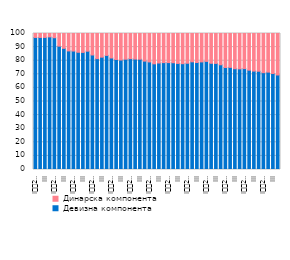
| Category | Девизна компонента | Динарска компонента |
|---|---|---|
| I
2008. | 97.1 | 2.9 |
| II | 97.1 | 2.9 |
| III | 97.1 | 2.9 |
| IV | 97.5 | 2.5 |
| I
2009. | 96.9 | 3.1 |
| II | 90.7 | 9.3 |
| III | 89.1 | 10.9 |
| IV | 87.2 | 12.8 |
| I
2010. | 87.1 | 12.9 |
| II | 86.2 | 13.8 |
| III | 86.1 | 13.9 |
| IV | 87 | 13 |
| I
2011. | 84.2 | 15.8 |
| II | 81.5 | 18.5 |
| III | 82.6 | 17.4 |
| IV | 83.9 | 16.1 |
| I
2012. | 82 | 18 |
| II | 80.9 | 19.1 |
| III | 80.5 | 19.5 |
| IV | 81.1 | 18.9 |
| I
2013. | 81.5 | 18.5 |
| II | 81.2 | 18.8 |
| III | 81.1 | 18.9 |
| IV | 79.7 | 20.3 |
| I
2014. | 79.1 | 20.9 |
| II | 77.7 | 22.3 |
| III | 78.3 | 21.7 |
| IV | 78.6 | 21.4 |
| I
2015. | 78.6 | 21.4 |
| II | 78.5 | 21.5 |
| III | 78 | 22 |
| IV | 77.8 | 22.2 |
| I
2016. | 78.138 | 21.862 |
| II | 79.184 | 20.816 |
| III | 78.654 | 21.346 |
| IV | 79.122 | 20.877 |
| I
2017. | 79.5 | 20.5 |
| II | 78.1 | 21.9 |
| III | 78 | 22 |
| IV | 77 | 23 |
| I
2018. | 75 | 25 |
| II | 75.1 | 24.9 |
| III | 74.1 | 25.9 |
| IV | 74 | 26 |
| I
2019. | 74.188 | 25.812 |
| II | 73.033 | 26.967 |
| III | 72.361 | 27.639 |
| IV | 72.253 | 27.747 |
| I
2020. | 71.2 | 28.8 |
| II | 71.6 | 28.4 |
| III | 70.6 | 29.4 |
| IV | 69.5 | 30.5 |